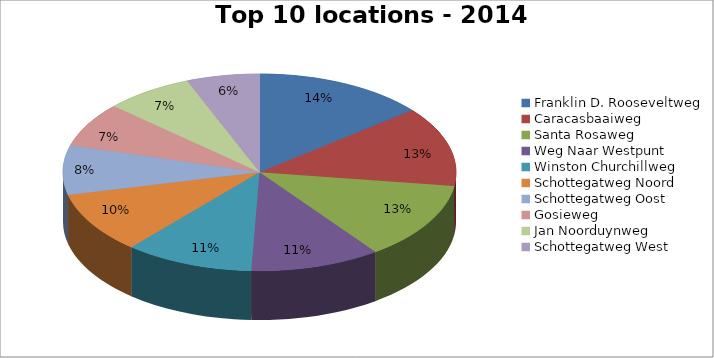
| Category | Series 0 |
|---|---|
| Franklin D. Rooseveltweg | 503 |
| Caracasbaaiweg | 466 |
| Santa Rosaweg | 453 |
| Weg Naar Westpunt | 380 |
| Winston Churchillweg | 377 |
| Schottegatweg Noord | 357 |
| Schottegatweg Oost | 289 |
| Gosieweg | 260 |
| Jan Noorduynweg | 259 |
| Schottegatweg West | 213 |